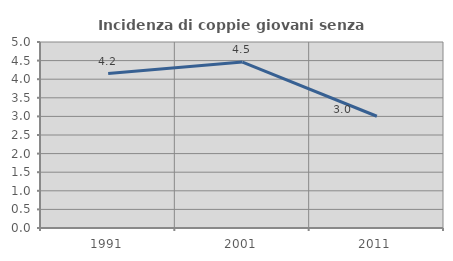
| Category | Incidenza di coppie giovani senza figli |
|---|---|
| 1991.0 | 4.153 |
| 2001.0 | 4.461 |
| 2011.0 | 3.004 |